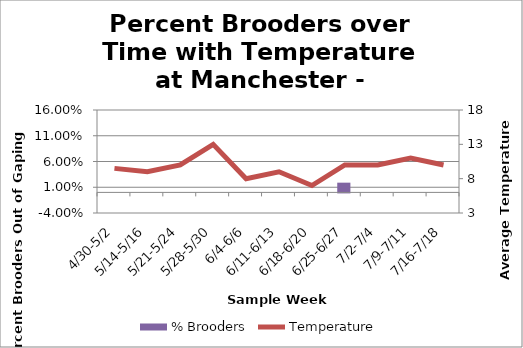
| Category | % Brooders |
|---|---|
| 4/30-5/2 | 0 |
| 5/14-5/16 | 0 |
| 5/21-5/24 | 0 |
| 5/28-5/30 | 0 |
| 6/4-6/6 | 0 |
| 6/11-6/13 | 0 |
| 6/18-6/20 | 0 |
| 6/25-6/27 | 0.019 |
| 7/2-7/4 | 0 |
| 7/9-7/11 | 0 |
| 7/16-7/18 | 0 |